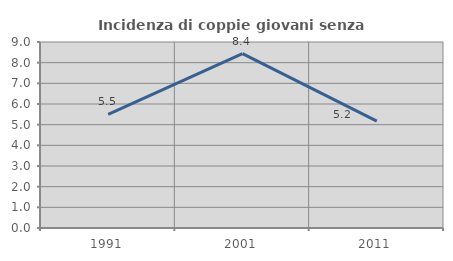
| Category | Incidenza di coppie giovani senza figli |
|---|---|
| 1991.0 | 5.499 |
| 2001.0 | 8.441 |
| 2011.0 | 5.171 |